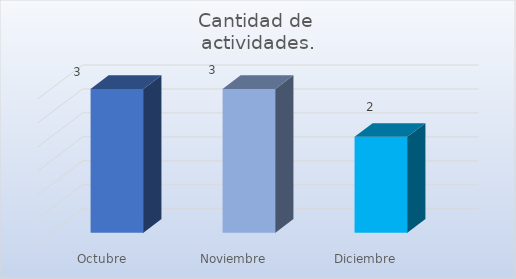
| Category | Cantidad de 
actividades. |
|---|---|
| Octubre | 3 |
| Noviembre | 3 |
| Diciembre | 2 |